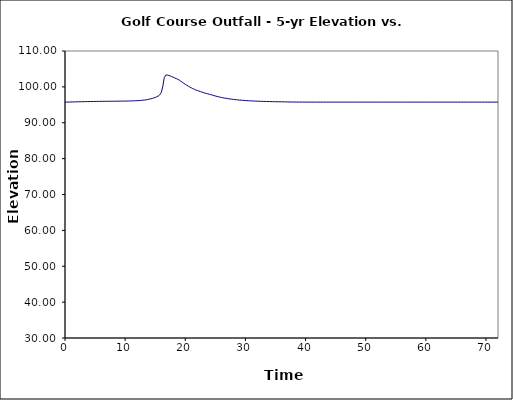
| Category | Series 1 |
|---|---|
| 0.0 | 95.75 |
| 0.25 | 95.753 |
| 0.5 | 95.76 |
| 0.75 | 95.772 |
| 1.0 | 95.786 |
| 1.25 | 95.8 |
| 1.5 | 95.813 |
| 1.75 | 95.825 |
| 2.0 | 95.837 |
| 2.25 | 95.848 |
| 2.5 | 95.858 |
| 2.75 | 95.867 |
| 3.0 | 95.877 |
| 3.25 | 95.885 |
| 3.5 | 95.894 |
| 3.75 | 95.902 |
| 4.0 | 95.909 |
| 4.25 | 95.916 |
| 4.5 | 95.923 |
| 4.75 | 95.93 |
| 5.0 | 95.936 |
| 5.25 | 95.943 |
| 5.5 | 95.948 |
| 5.75 | 95.954 |
| 6.0 | 95.959 |
| 6.25 | 95.964 |
| 6.5 | 95.969 |
| 6.75 | 95.975 |
| 7.0 | 95.979 |
| 7.25 | 95.985 |
| 7.5 | 95.989 |
| 7.75 | 95.993 |
| 8.0 | 95.997 |
| 8.25 | 96.003 |
| 8.5 | 96.007 |
| 8.75 | 96.011 |
| 9.0 | 96.015 |
| 9.25 | 96.021 |
| 9.5 | 96.026 |
| 9.75 | 96.033 |
| 10.0 | 96.043 |
| 10.25 | 96.053 |
| 10.5 | 96.061 |
| 10.75 | 96.07 |
| 11.0 | 96.081 |
| 11.25 | 96.094 |
| 11.5 | 96.11 |
| 11.75 | 96.13 |
| 12.0 | 96.154 |
| 12.25 | 96.18 |
| 12.5 | 96.211 |
| 12.75 | 96.246 |
| 13.0 | 96.285 |
| 13.25 | 96.334 |
| 13.5 | 96.398 |
| 13.75 | 96.478 |
| 14.0 | 96.568 |
| 14.25 | 96.667 |
| 14.5 | 96.778 |
| 14.75 | 96.903 |
| 15.0 | 97.049 |
| 15.25 | 97.226 |
| 15.5 | 97.452 |
| 15.75 | 97.779 |
| 16.0 | 98.398 |
| 16.25 | 100.031 |
| 16.5 | 102.533 |
| 16.75 | 103.265 |
| 17.0 | 103.312 |
| 17.25 | 103.184 |
| 17.5 | 103.038 |
| 17.75 | 102.865 |
| 18.0 | 102.681 |
| 18.25 | 102.495 |
| 18.5 | 102.301 |
| 18.75 | 102.124 |
| 19.0 | 101.889 |
| 19.25 | 101.59 |
| 19.5 | 101.291 |
| 19.75 | 100.996 |
| 20.0 | 100.717 |
| 20.25 | 100.453 |
| 20.5 | 100.202 |
| 20.75 | 99.964 |
| 21.0 | 99.738 |
| 21.25 | 99.526 |
| 21.5 | 99.325 |
| 21.75 | 99.135 |
| 22.0 | 98.987 |
| 22.25 | 98.854 |
| 22.5 | 98.699 |
| 22.75 | 98.551 |
| 23.0 | 98.416 |
| 23.25 | 98.287 |
| 23.5 | 98.164 |
| 23.75 | 98.048 |
| 24.0 | 97.938 |
| 24.25 | 97.828 |
| 24.5 | 97.709 |
| 24.75 | 97.586 |
| 25.0 | 97.465 |
| 25.25 | 97.352 |
| 25.5 | 97.246 |
| 25.75 | 97.148 |
| 26.0 | 97.056 |
| 26.25 | 96.97 |
| 26.5 | 96.891 |
| 26.75 | 96.815 |
| 27.0 | 96.746 |
| 27.25 | 96.681 |
| 27.5 | 96.62 |
| 27.75 | 96.563 |
| 28.0 | 96.505 |
| 28.25 | 96.455 |
| 28.5 | 96.41 |
| 28.75 | 96.367 |
| 29.0 | 96.328 |
| 29.25 | 96.29 |
| 29.5 | 96.255 |
| 29.75 | 96.223 |
| 30.0 | 96.193 |
| 30.25 | 96.165 |
| 30.5 | 96.138 |
| 30.75 | 96.113 |
| 31.0 | 96.091 |
| 31.25 | 96.068 |
| 31.5 | 96.047 |
| 31.75 | 96.029 |
| 32.0 | 96.011 |
| 32.25 | 95.994 |
| 32.5 | 95.979 |
| 32.75 | 95.964 |
| 33.0 | 95.951 |
| 33.25 | 95.937 |
| 33.5 | 95.926 |
| 33.75 | 95.915 |
| 34.0 | 95.904 |
| 34.25 | 95.894 |
| 34.5 | 95.884 |
| 34.75 | 95.874 |
| 35.0 | 95.866 |
| 35.25 | 95.859 |
| 35.5 | 95.851 |
| 35.75 | 95.844 |
| 36.0 | 95.837 |
| 36.25 | 95.83 |
| 36.5 | 95.823 |
| 36.75 | 95.816 |
| 37.0 | 95.804 |
| 37.25 | 95.79 |
| 37.5 | 95.781 |
| 37.75 | 95.777 |
| 38.0 | 95.774 |
| 38.25 | 95.771 |
| 38.5 | 95.768 |
| 38.75 | 95.767 |
| 39.0 | 95.764 |
| 39.25 | 95.763 |
| 39.5 | 95.761 |
| 39.75 | 95.76 |
| 40.0 | 95.758 |
| 40.25 | 95.758 |
| 40.5 | 95.757 |
| 40.75 | 95.757 |
| 41.0 | 95.756 |
| 41.25 | 95.756 |
| 41.5 | 95.754 |
| 41.75 | 95.754 |
| 42.0 | 95.754 |
| 42.25 | 95.753 |
| 42.5 | 95.753 |
| 42.75 | 95.753 |
| 43.0 | 95.751 |
| 43.25 | 95.751 |
| 43.5 | 95.751 |
| 43.75 | 95.751 |
| 44.0 | 95.751 |
| 44.25 | 95.75 |
| 44.5 | 95.75 |
| 44.75 | 95.75 |
| 45.0 | 95.75 |
| 45.25 | 95.75 |
| 45.5 | 95.75 |
| 45.75 | 95.75 |
| 46.0 | 95.75 |
| 46.25 | 95.75 |
| 46.5 | 95.75 |
| 46.75 | 95.75 |
| 47.0 | 95.75 |
| 47.25 | 95.75 |
| 47.5 | 95.75 |
| 47.75 | 95.75 |
| 48.0 | 95.75 |
| 48.25 | 95.75 |
| 48.5 | 95.75 |
| 48.75 | 95.75 |
| 49.0 | 95.75 |
| 49.25 | 95.75 |
| 49.5 | 95.75 |
| 49.75 | 95.75 |
| 50.0 | 95.75 |
| 50.25 | 95.75 |
| 50.5 | 95.75 |
| 50.75 | 95.75 |
| 51.0 | 95.75 |
| 51.25 | 95.75 |
| 51.5 | 95.75 |
| 51.75 | 95.75 |
| 52.0 | 95.75 |
| 52.25 | 95.75 |
| 52.5 | 95.75 |
| 52.75 | 95.75 |
| 53.0 | 95.75 |
| 53.25 | 95.75 |
| 53.5 | 95.75 |
| 53.75 | 95.75 |
| 54.0 | 95.75 |
| 54.25 | 95.75 |
| 54.5 | 95.75 |
| 54.75 | 95.75 |
| 55.0 | 95.75 |
| 55.25 | 95.75 |
| 55.5 | 95.75 |
| 55.75 | 95.75 |
| 56.0 | 95.75 |
| 56.25 | 95.75 |
| 56.5 | 95.75 |
| 56.75 | 95.75 |
| 57.0 | 95.75 |
| 57.25 | 95.75 |
| 57.5 | 95.75 |
| 57.75 | 95.75 |
| 58.0 | 95.75 |
| 58.25 | 95.75 |
| 58.5 | 95.75 |
| 58.75 | 95.75 |
| 59.0 | 95.75 |
| 59.25 | 95.75 |
| 59.5 | 95.75 |
| 59.75 | 95.75 |
| 60.0 | 95.75 |
| 60.25 | 95.75 |
| 60.5 | 95.75 |
| 60.75 | 95.75 |
| 61.0 | 95.75 |
| 61.25 | 95.75 |
| 61.5 | 95.75 |
| 61.75 | 95.75 |
| 62.0 | 95.75 |
| 62.25 | 95.75 |
| 62.5 | 95.75 |
| 62.75 | 95.75 |
| 63.0 | 95.75 |
| 63.25 | 95.75 |
| 63.5 | 95.75 |
| 63.75 | 95.75 |
| 64.0 | 95.75 |
| 64.25 | 95.75 |
| 64.5 | 95.75 |
| 64.75 | 95.75 |
| 65.0 | 95.75 |
| 65.25 | 95.75 |
| 65.5 | 95.75 |
| 65.75 | 95.75 |
| 66.0 | 95.75 |
| 66.25 | 95.75 |
| 66.5 | 95.75 |
| 66.75 | 95.75 |
| 67.0 | 95.75 |
| 67.25 | 95.75 |
| 67.5 | 95.75 |
| 67.75 | 95.75 |
| 68.0 | 95.75 |
| 68.25 | 95.75 |
| 68.5 | 95.75 |
| 68.75 | 95.75 |
| 69.0 | 95.75 |
| 69.25 | 95.75 |
| 69.5 | 95.75 |
| 69.75 | 95.75 |
| 70.0 | 95.75 |
| 70.25 | 95.75 |
| 70.5 | 95.75 |
| 70.75 | 95.75 |
| 71.0 | 95.75 |
| 71.25 | 95.75 |
| 71.5 | 95.75 |
| 71.75 | 95.75 |
| 72.0 | 95.75 |
| 72.25 | 95.75 |
| 72.5 | 95.75 |
| 72.75 | 95.75 |
| 73.0 | 95.75 |
| 73.25 | 95.75 |
| 73.5 | 95.75 |
| 73.75 | 95.75 |
| 74.0 | 95.75 |
| 74.25 | 95.75 |
| 74.5 | 95.75 |
| 74.75 | 95.75 |
| 75.0 | 95.75 |
| 75.25 | 95.75 |
| 75.5 | 95.75 |
| 75.75 | 95.75 |
| 76.0 | 95.75 |
| 76.25 | 95.75 |
| 76.5 | 95.75 |
| 76.75 | 95.75 |
| 77.0 | 95.75 |
| 77.25 | 95.75 |
| 77.5 | 95.75 |
| 77.75 | 95.75 |
| 78.0 | 95.75 |
| 78.25 | 95.75 |
| 78.5 | 95.75 |
| 78.75 | 95.75 |
| 79.0 | 95.75 |
| 79.25 | 95.75 |
| 79.5 | 95.75 |
| 79.75 | 95.75 |
| 80.0 | 95.75 |
| 80.25 | 95.75 |
| 80.5 | 95.75 |
| 80.75 | 95.75 |
| 81.0 | 95.75 |
| 81.25 | 95.75 |
| 81.5 | 95.75 |
| 81.75 | 95.75 |
| 82.0 | 95.75 |
| 82.25 | 95.75 |
| 82.5 | 95.75 |
| 82.75 | 95.75 |
| 83.0 | 95.75 |
| 83.25 | 95.75 |
| 83.5 | 95.75 |
| 83.75 | 95.75 |
| 84.0 | 95.75 |
| 84.25 | 95.75 |
| 84.5 | 95.75 |
| 84.75 | 95.75 |
| 85.0 | 95.75 |
| 85.25 | 95.75 |
| 85.5 | 95.75 |
| 85.75 | 95.75 |
| 86.0 | 95.75 |
| 86.25 | 95.75 |
| 86.5 | 95.75 |
| 86.75 | 95.75 |
| 87.0 | 95.75 |
| 87.25 | 95.75 |
| 87.5 | 95.75 |
| 87.75 | 95.75 |
| 88.0 | 95.75 |
| 88.25 | 95.75 |
| 88.5 | 95.75 |
| 88.75 | 95.75 |
| 89.0 | 95.75 |
| 89.25 | 95.75 |
| 89.5 | 95.75 |
| 89.75 | 95.75 |
| 90.0 | 95.75 |
| 90.25 | 95.75 |
| 90.5 | 95.75 |
| 90.75 | 95.75 |
| 91.0 | 95.75 |
| 91.25 | 95.75 |
| 91.5 | 95.75 |
| 91.75 | 95.75 |
| 92.0 | 95.75 |
| 92.25 | 95.75 |
| 92.5 | 95.75 |
| 92.75 | 95.75 |
| 93.0 | 95.75 |
| 93.25 | 95.75 |
| 93.5 | 95.75 |
| 93.75 | 95.75 |
| 94.0 | 95.75 |
| 94.25 | 95.75 |
| 94.5 | 95.75 |
| 94.75 | 95.75 |
| 95.0 | 95.75 |
| 95.25 | 95.75 |
| 95.5 | 95.75 |
| 95.75 | 95.75 |
| 96.0 | 95.75 |
| 96.25 | 95.75 |
| 96.5 | 95.75 |
| 96.75 | 95.75 |
| 97.0 | 95.75 |
| 97.25 | 95.75 |
| 97.5 | 95.75 |
| 97.75 | 95.75 |
| 98.0 | 95.75 |
| 98.25 | 95.75 |
| 98.5 | 95.75 |
| 98.75 | 95.75 |
| 99.0 | 95.75 |
| 99.25 | 95.75 |
| 99.5 | 95.75 |
| 99.75 | 95.75 |
| 100.0 | 95.75 |
| 100.25 | 95.75 |
| 100.5 | 95.75 |
| 100.75 | 95.75 |
| 101.0 | 95.75 |
| 101.25 | 95.75 |
| 101.5 | 95.75 |
| 101.75 | 95.75 |
| 102.0 | 95.75 |
| 102.25 | 95.75 |
| 102.5 | 95.75 |
| 102.75 | 95.75 |
| 103.0 | 95.75 |
| 103.25 | 95.75 |
| 103.5 | 95.75 |
| 103.75 | 95.75 |
| 104.0 | 95.75 |
| 104.25 | 95.75 |
| 104.5 | 95.75 |
| 104.75 | 95.75 |
| 105.0 | 95.75 |
| 105.25 | 95.75 |
| 105.5 | 95.75 |
| 105.75 | 95.75 |
| 106.0 | 95.75 |
| 106.25 | 95.75 |
| 106.5 | 95.75 |
| 106.75 | 95.75 |
| 107.0 | 95.75 |
| 107.25 | 95.75 |
| 107.5 | 95.75 |
| 107.75 | 95.75 |
| 108.0 | 95.75 |
| 108.25 | 95.75 |
| 108.5 | 95.75 |
| 108.75 | 95.75 |
| 109.0 | 95.75 |
| 109.25 | 95.75 |
| 109.5 | 95.75 |
| 109.75 | 95.75 |
| 110.0 | 95.75 |
| 110.25 | 95.75 |
| 110.5 | 95.75 |
| 110.75 | 95.75 |
| 111.0 | 95.75 |
| 111.25 | 95.75 |
| 111.5 | 95.75 |
| 111.75 | 95.75 |
| 112.0 | 95.75 |
| 112.25 | 95.75 |
| 112.5 | 95.75 |
| 112.75 | 95.75 |
| 113.0 | 95.75 |
| 113.25 | 95.75 |
| 113.5 | 95.75 |
| 113.75 | 95.75 |
| 114.0 | 95.75 |
| 114.25 | 95.75 |
| 114.5 | 95.75 |
| 114.75 | 95.75 |
| 115.0 | 95.75 |
| 115.25 | 95.75 |
| 115.5 | 95.75 |
| 115.75 | 95.75 |
| 116.0 | 95.75 |
| 116.25 | 95.75 |
| 116.5 | 95.75 |
| 116.75 | 95.75 |
| 117.0 | 95.75 |
| 117.25 | 95.75 |
| 117.5 | 95.75 |
| 117.75 | 95.75 |
| 118.0 | 95.75 |
| 118.25 | 95.75 |
| 118.5 | 95.75 |
| 118.75 | 95.75 |
| 119.0 | 95.75 |
| 119.25 | 95.75 |
| 119.5 | 95.75 |
| 119.75 | 95.75 |
| 120.0 | 95.75 |
| 120.25 | 95.75 |
| 120.5 | 95.75 |
| 120.75 | 95.75 |
| 121.0 | 95.75 |
| 121.25 | 95.75 |
| 121.5 | 95.75 |
| 121.75 | 95.75 |
| 122.0 | 95.75 |
| 122.25 | 95.75 |
| 122.5 | 95.75 |
| 122.75 | 95.75 |
| 123.0 | 95.75 |
| 123.25 | 95.75 |
| 123.5 | 95.75 |
| 123.75 | 95.75 |
| 124.0 | 95.75 |
| 124.25 | 95.75 |
| 124.5 | 95.75 |
| 124.75 | 95.75 |
| 125.0 | 95.75 |
| 125.25 | 95.75 |
| 125.5 | 95.75 |
| 125.75 | 95.75 |
| 126.0 | 95.75 |
| 126.25 | 95.75 |
| 126.5 | 95.75 |
| 126.75 | 95.75 |
| 127.0 | 95.75 |
| 127.25 | 95.75 |
| 127.5 | 95.75 |
| 127.75 | 95.75 |
| 128.0 | 95.75 |
| 128.25 | 95.75 |
| 128.5 | 95.75 |
| 128.75 | 95.75 |
| 129.0 | 95.75 |
| 129.25 | 95.75 |
| 129.5 | 95.75 |
| 129.75 | 95.75 |
| 130.0 | 95.75 |
| 130.25 | 95.75 |
| 130.5 | 95.75 |
| 130.75 | 95.75 |
| 131.0 | 95.75 |
| 131.25 | 95.75 |
| 131.5 | 95.75 |
| 131.75 | 95.75 |
| 132.0 | 95.75 |
| 132.25 | 95.75 |
| 132.5 | 95.75 |
| 132.75 | 95.75 |
| 133.0 | 95.75 |
| 133.25 | 95.75 |
| 133.5 | 95.75 |
| 133.75 | 95.75 |
| 134.0 | 95.75 |
| 134.25 | 95.75 |
| 134.5 | 95.75 |
| 134.75 | 95.75 |
| 135.0 | 95.75 |
| 135.25 | 95.75 |
| 135.5 | 95.75 |
| 135.75 | 95.75 |
| 136.0 | 95.75 |
| 136.25 | 95.75 |
| 136.5 | 95.75 |
| 136.75 | 95.75 |
| 137.0 | 95.75 |
| 137.25 | 95.75 |
| 137.5 | 95.75 |
| 137.75 | 95.75 |
| 138.0 | 95.75 |
| 138.25 | 95.75 |
| 138.5 | 95.75 |
| 138.75 | 95.75 |
| 139.0 | 95.75 |
| 139.25 | 95.75 |
| 139.5 | 95.75 |
| 139.75 | 95.75 |
| 140.0 | 95.75 |
| 140.25 | 95.75 |
| 140.5 | 95.75 |
| 140.75 | 95.75 |
| 141.0 | 95.75 |
| 141.25 | 95.75 |
| 141.5 | 95.75 |
| 141.75 | 95.75 |
| 142.0 | 95.75 |
| 142.25 | 95.75 |
| 142.5 | 95.75 |
| 142.75 | 95.75 |
| 143.0 | 95.75 |
| 143.25 | 95.75 |
| 143.5 | 95.75 |
| 143.75 | 95.75 |
| 144.0 | 95.75 |
| 144.25 | 95.75 |
| 144.5 | 95.75 |
| 144.75 | 95.75 |
| 145.0 | 95.75 |
| 145.25 | 95.75 |
| 145.5 | 95.75 |
| 145.75 | 95.75 |
| 146.0 | 95.75 |
| 146.25 | 95.75 |
| 146.5 | 95.75 |
| 146.75 | 95.75 |
| 147.0 | 95.75 |
| 147.25 | 95.75 |
| 147.5 | 95.75 |
| 147.75 | 95.75 |
| 148.0 | 95.75 |
| 148.25 | 95.75 |
| 148.5 | 95.75 |
| 148.75 | 95.75 |
| 149.0 | 95.75 |
| 149.25 | 95.75 |
| 149.5 | 95.75 |
| 149.75 | 95.75 |
| 150.0 | 95.75 |
| 150.25 | 95.75 |
| 150.5 | 95.75 |
| 150.75 | 95.75 |
| 151.0 | 95.75 |
| 151.25 | 95.75 |
| 151.5 | 95.75 |
| 151.75 | 95.75 |
| 152.0 | 95.75 |
| 152.25 | 95.75 |
| 152.5 | 95.75 |
| 152.75 | 95.75 |
| 153.0 | 95.75 |
| 153.25 | 95.75 |
| 153.5 | 95.75 |
| 153.75 | 95.75 |
| 154.0 | 95.75 |
| 154.25 | 95.75 |
| 154.5 | 95.75 |
| 154.75 | 95.75 |
| 155.0 | 95.75 |
| 155.25 | 95.75 |
| 155.5 | 95.75 |
| 155.75 | 95.75 |
| 156.0 | 95.75 |
| 156.25 | 95.75 |
| 156.5 | 95.75 |
| 156.75 | 95.75 |
| 157.0 | 95.75 |
| 157.25 | 95.75 |
| 157.5 | 95.75 |
| 157.75 | 95.75 |
| 158.0 | 95.75 |
| 158.25 | 95.75 |
| 158.5 | 95.75 |
| 158.75 | 95.75 |
| 159.0 | 95.75 |
| 159.25 | 95.75 |
| 159.5 | 95.75 |
| 159.75 | 95.75 |
| 160.0 | 95.75 |
| 160.25 | 95.75 |
| 160.5 | 95.75 |
| 160.75 | 95.75 |
| 161.0 | 95.75 |
| 161.25 | 95.75 |
| 161.5 | 95.75 |
| 161.75 | 95.75 |
| 162.0 | 95.75 |
| 162.25 | 95.75 |
| 162.5 | 95.75 |
| 162.75 | 95.75 |
| 163.0 | 95.75 |
| 163.25 | 95.75 |
| 163.5 | 95.75 |
| 163.75 | 95.75 |
| 164.0 | 95.75 |
| 164.25 | 95.75 |
| 164.5 | 95.75 |
| 164.75 | 95.75 |
| 165.0 | 95.75 |
| 165.25 | 95.75 |
| 165.5 | 95.75 |
| 165.75 | 95.75 |
| 166.0 | 95.75 |
| 166.25 | 95.75 |
| 166.5 | 95.75 |
| 166.75 | 95.75 |
| 167.0 | 95.75 |
| 167.25 | 95.75 |
| 167.5 | 95.75 |
| 167.75 | 95.75 |
| 168.0 | 95.75 |
| 168.25 | 95.75 |
| 168.5 | 95.75 |
| 168.75 | 95.75 |
| 169.0 | 95.75 |
| 169.25 | 95.75 |
| 169.5 | 95.75 |
| 169.75 | 95.75 |
| 170.0 | 95.75 |
| 170.25 | 95.75 |
| 170.5 | 95.75 |
| 170.75 | 95.75 |
| 171.0 | 95.75 |
| 171.25 | 95.75 |
| 171.5 | 95.75 |
| 171.75 | 95.75 |
| 172.0 | 95.75 |
| 172.25 | 95.75 |
| 172.5 | 95.75 |
| 172.75 | 95.75 |
| 173.0 | 95.75 |
| 173.25 | 95.75 |
| 173.5 | 95.75 |
| 173.75 | 95.75 |
| 174.0 | 95.75 |
| 174.25 | 95.75 |
| 174.5 | 95.75 |
| 174.75 | 95.75 |
| 175.0 | 95.75 |
| 175.25 | 95.75 |
| 175.5 | 95.75 |
| 175.75 | 95.75 |
| 176.0 | 95.75 |
| 176.25 | 95.75 |
| 176.5 | 95.75 |
| 176.75 | 95.75 |
| 177.0 | 95.75 |
| 177.25 | 95.75 |
| 177.5 | 95.75 |
| 177.75 | 95.75 |
| 178.0 | 95.75 |
| 178.25 | 95.75 |
| 178.5 | 95.75 |
| 178.75 | 95.75 |
| 179.0 | 95.75 |
| 179.25 | 95.75 |
| 179.5 | 95.75 |
| 179.75 | 95.75 |
| 180.0 | 95.75 |
| 180.25 | 95.75 |
| 180.5 | 95.75 |
| 180.75 | 95.75 |
| 181.0 | 95.75 |
| 181.25 | 95.75 |
| 181.5 | 95.75 |
| 181.75 | 95.75 |
| 182.0 | 95.75 |
| 182.25 | 95.75 |
| 182.5 | 95.75 |
| 182.75 | 95.75 |
| 183.0 | 95.75 |
| 183.25 | 95.75 |
| 183.5 | 95.75 |
| 183.75 | 95.75 |
| 184.0 | 95.75 |
| 184.25 | 95.75 |
| 184.5 | 95.75 |
| 184.75 | 95.75 |
| 185.0 | 95.75 |
| 185.25 | 95.75 |
| 185.5 | 95.75 |
| 185.75 | 95.75 |
| 186.0 | 95.75 |
| 186.25 | 95.75 |
| 186.5 | 95.75 |
| 186.75 | 95.75 |
| 187.0 | 95.75 |
| 187.25 | 95.75 |
| 187.5 | 95.75 |
| 187.75 | 95.75 |
| 188.0 | 95.75 |
| 188.25 | 95.75 |
| 188.5 | 95.75 |
| 188.75 | 95.75 |
| 189.0 | 95.75 |
| 189.25 | 95.75 |
| 189.5 | 95.75 |
| 189.75 | 95.75 |
| 190.0 | 95.75 |
| 190.25 | 95.75 |
| 190.5 | 95.75 |
| 190.75 | 95.75 |
| 191.0 | 95.75 |
| 191.25 | 95.75 |
| 191.5 | 95.75 |
| 191.75 | 95.75 |